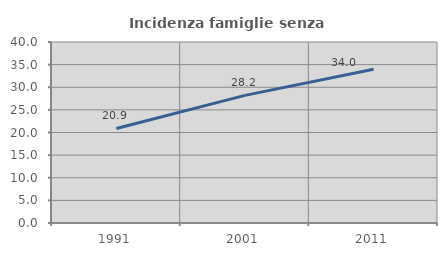
| Category | Incidenza famiglie senza nuclei |
|---|---|
| 1991.0 | 20.893 |
| 2001.0 | 28.202 |
| 2011.0 | 33.986 |